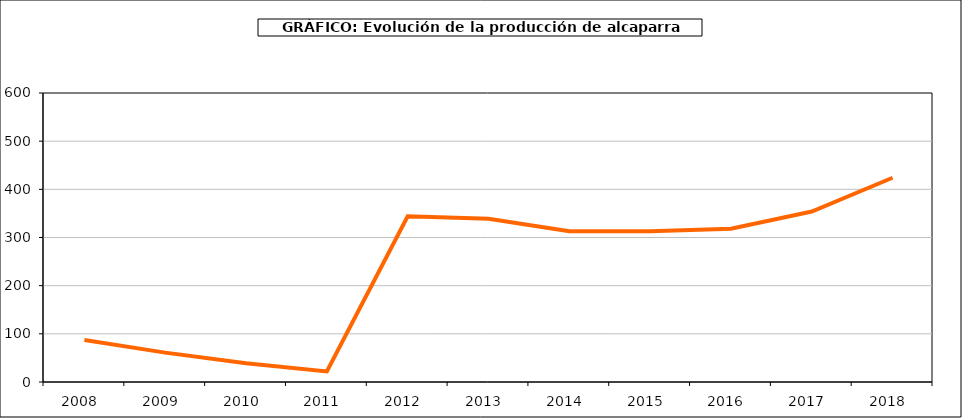
| Category | producción |
|---|---|
| 2008.0 | 87 |
| 2009.0 | 61 |
| 2010.0 | 39 |
| 2011.0 | 22 |
| 2012.0 | 344 |
| 2013.0 | 339 |
| 2014.0 | 313 |
| 2015.0 | 313 |
| 2016.0 | 318 |
| 2017.0 | 354 |
| 2018.0 | 424 |